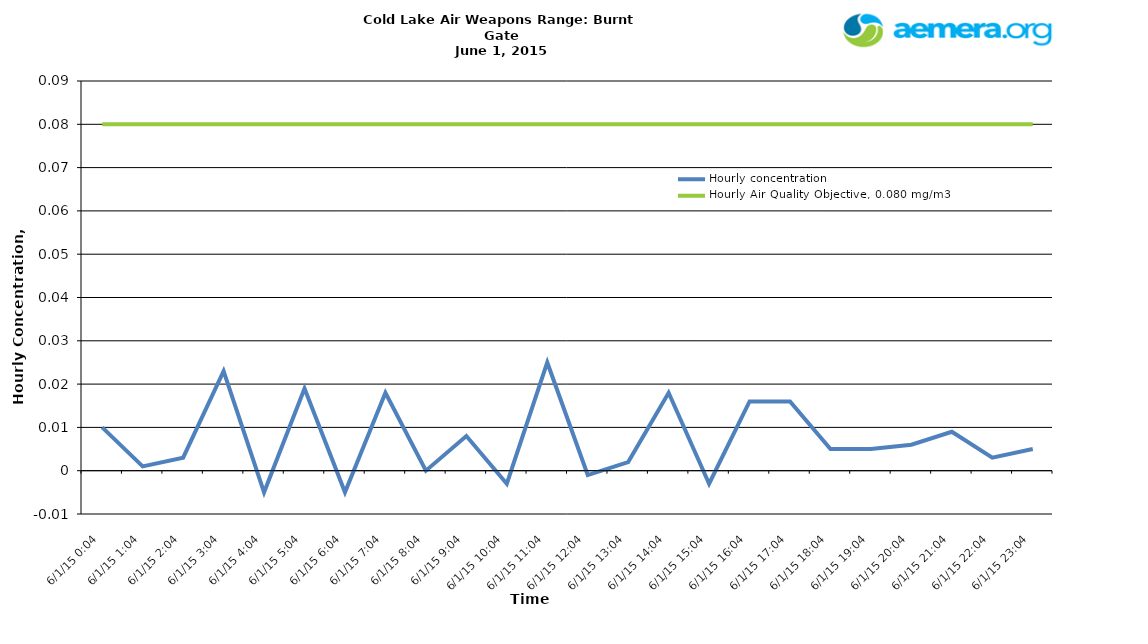
| Category | Hourly concentration | Hourly Air Quality Objective, 0.080 mg/m3 |
|---|---|---|
| 6/1/15 | 0.01 | 0.08 |
| 6/1/15 | 0.001 | 0.08 |
| 6/1/15 | 0.003 | 0.08 |
| 6/1/15 | 0.023 | 0.08 |
| 6/1/15 | -0.005 | 0.08 |
| 6/1/15 | 0.019 | 0.08 |
| 6/1/15 | -0.005 | 0.08 |
| 6/1/15 | 0.018 | 0.08 |
| 6/1/15 | 0 | 0.08 |
| 6/1/15 | 0.008 | 0.08 |
| 6/1/15 | -0.003 | 0.08 |
| 6/1/15 | 0.025 | 0.08 |
| 6/1/15 | -0.001 | 0.08 |
| 6/1/15 | 0.002 | 0.08 |
| 6/1/15 | 0.018 | 0.08 |
| 6/1/15 | -0.003 | 0.08 |
| 6/1/15 | 0.016 | 0.08 |
| 6/1/15 | 0.016 | 0.08 |
| 6/1/15 | 0.005 | 0.08 |
| 6/1/15 | 0.005 | 0.08 |
| 6/1/15 | 0.006 | 0.08 |
| 6/1/15 | 0.009 | 0.08 |
| 6/1/15 | 0.003 | 0.08 |
| 6/1/15 | 0.005 | 0.08 |